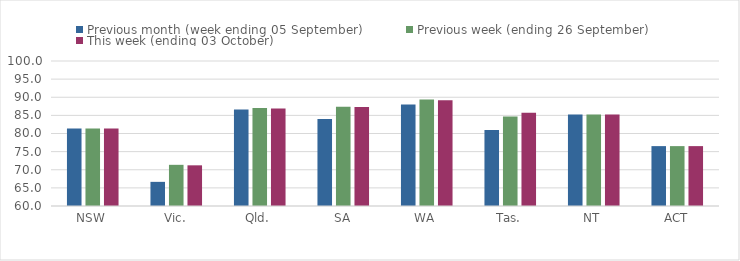
| Category | Previous month (week ending 05 September) | Previous week (ending 26 September) | This week (ending 03 October) |
|---|---|---|---|
| NSW | 81.37 | 81.37 | 81.37 |
| Vic. | 66.66 | 71.36 | 71.22 |
| Qld. | 86.63 | 87.02 | 86.88 |
| SA | 84.01 | 87.37 | 87.28 |
| WA | 87.97 | 89.39 | 89.19 |
| Tas. | 80.94 | 84.66 | 85.71 |
| NT | 85.24 | 85.24 | 85.24 |
| ACT | 76.52 | 76.52 | 76.52 |